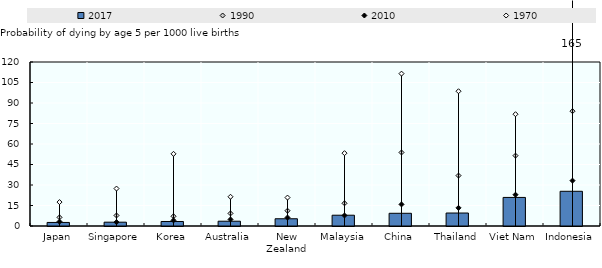
| Category | 2017 |
|---|---|
| Japan | 2.6 |
| Singapore | 2.8 |
| Korea | 3.3 |
| Australia | 3.5 |
| New Zealand | 5.3 |
| Malaysia | 7.9 |
| China | 9.3 |
| Thailand | 9.5 |
| Viet Nam | 20.9 |
| Indonesia | 25.4 |